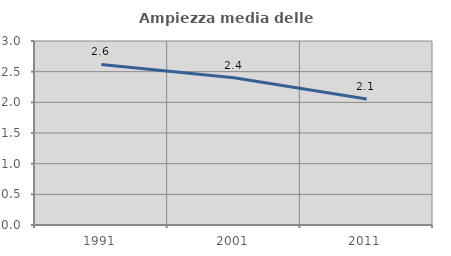
| Category | Ampiezza media delle famiglie |
|---|---|
| 1991.0 | 2.618 |
| 2001.0 | 2.401 |
| 2011.0 | 2.053 |